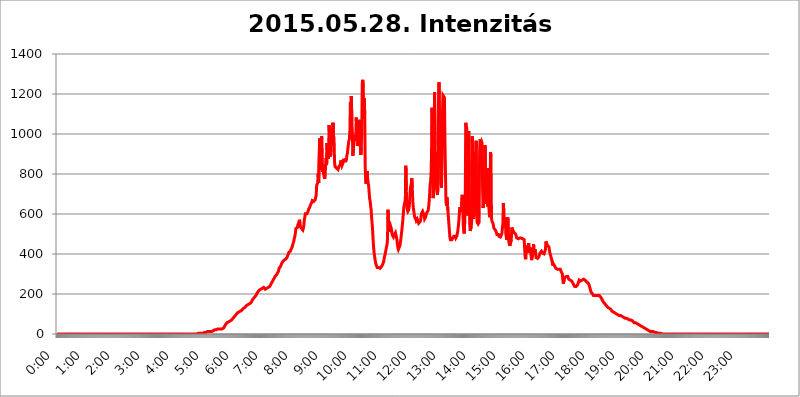
| Category | 2015.05.28. Intenzitás [W/m^2] |
|---|---|
| 0.0 | 0 |
| 0.0006944444444444445 | 0 |
| 0.001388888888888889 | 0 |
| 0.0020833333333333333 | 0 |
| 0.002777777777777778 | 0 |
| 0.003472222222222222 | 0 |
| 0.004166666666666667 | 0 |
| 0.004861111111111111 | 0 |
| 0.005555555555555556 | 0 |
| 0.0062499999999999995 | 0 |
| 0.006944444444444444 | 0 |
| 0.007638888888888889 | 0 |
| 0.008333333333333333 | 0 |
| 0.009027777777777779 | 0 |
| 0.009722222222222222 | 0 |
| 0.010416666666666666 | 0 |
| 0.011111111111111112 | 0 |
| 0.011805555555555555 | 0 |
| 0.012499999999999999 | 0 |
| 0.013194444444444444 | 0 |
| 0.013888888888888888 | 0 |
| 0.014583333333333332 | 0 |
| 0.015277777777777777 | 0 |
| 0.015972222222222224 | 0 |
| 0.016666666666666666 | 0 |
| 0.017361111111111112 | 0 |
| 0.018055555555555557 | 0 |
| 0.01875 | 0 |
| 0.019444444444444445 | 0 |
| 0.02013888888888889 | 0 |
| 0.020833333333333332 | 0 |
| 0.02152777777777778 | 0 |
| 0.022222222222222223 | 0 |
| 0.02291666666666667 | 0 |
| 0.02361111111111111 | 0 |
| 0.024305555555555556 | 0 |
| 0.024999999999999998 | 0 |
| 0.025694444444444447 | 0 |
| 0.02638888888888889 | 0 |
| 0.027083333333333334 | 0 |
| 0.027777777777777776 | 0 |
| 0.02847222222222222 | 0 |
| 0.029166666666666664 | 0 |
| 0.029861111111111113 | 0 |
| 0.030555555555555555 | 0 |
| 0.03125 | 0 |
| 0.03194444444444445 | 0 |
| 0.03263888888888889 | 0 |
| 0.03333333333333333 | 0 |
| 0.034027777777777775 | 0 |
| 0.034722222222222224 | 0 |
| 0.035416666666666666 | 0 |
| 0.036111111111111115 | 0 |
| 0.03680555555555556 | 0 |
| 0.0375 | 0 |
| 0.03819444444444444 | 0 |
| 0.03888888888888889 | 0 |
| 0.03958333333333333 | 0 |
| 0.04027777777777778 | 0 |
| 0.04097222222222222 | 0 |
| 0.041666666666666664 | 0 |
| 0.042361111111111106 | 0 |
| 0.04305555555555556 | 0 |
| 0.043750000000000004 | 0 |
| 0.044444444444444446 | 0 |
| 0.04513888888888889 | 0 |
| 0.04583333333333334 | 0 |
| 0.04652777777777778 | 0 |
| 0.04722222222222222 | 0 |
| 0.04791666666666666 | 0 |
| 0.04861111111111111 | 0 |
| 0.049305555555555554 | 0 |
| 0.049999999999999996 | 0 |
| 0.05069444444444445 | 0 |
| 0.051388888888888894 | 0 |
| 0.052083333333333336 | 0 |
| 0.05277777777777778 | 0 |
| 0.05347222222222222 | 0 |
| 0.05416666666666667 | 0 |
| 0.05486111111111111 | 0 |
| 0.05555555555555555 | 0 |
| 0.05625 | 0 |
| 0.05694444444444444 | 0 |
| 0.057638888888888885 | 0 |
| 0.05833333333333333 | 0 |
| 0.05902777777777778 | 0 |
| 0.059722222222222225 | 0 |
| 0.06041666666666667 | 0 |
| 0.061111111111111116 | 0 |
| 0.06180555555555556 | 0 |
| 0.0625 | 0 |
| 0.06319444444444444 | 0 |
| 0.06388888888888888 | 0 |
| 0.06458333333333334 | 0 |
| 0.06527777777777778 | 0 |
| 0.06597222222222222 | 0 |
| 0.06666666666666667 | 0 |
| 0.06736111111111111 | 0 |
| 0.06805555555555555 | 0 |
| 0.06874999999999999 | 0 |
| 0.06944444444444443 | 0 |
| 0.07013888888888889 | 0 |
| 0.07083333333333333 | 0 |
| 0.07152777777777779 | 0 |
| 0.07222222222222223 | 0 |
| 0.07291666666666667 | 0 |
| 0.07361111111111111 | 0 |
| 0.07430555555555556 | 0 |
| 0.075 | 0 |
| 0.07569444444444444 | 0 |
| 0.0763888888888889 | 0 |
| 0.07708333333333334 | 0 |
| 0.07777777777777778 | 0 |
| 0.07847222222222222 | 0 |
| 0.07916666666666666 | 0 |
| 0.0798611111111111 | 0 |
| 0.08055555555555556 | 0 |
| 0.08125 | 0 |
| 0.08194444444444444 | 0 |
| 0.08263888888888889 | 0 |
| 0.08333333333333333 | 0 |
| 0.08402777777777777 | 0 |
| 0.08472222222222221 | 0 |
| 0.08541666666666665 | 0 |
| 0.08611111111111112 | 0 |
| 0.08680555555555557 | 0 |
| 0.08750000000000001 | 0 |
| 0.08819444444444445 | 0 |
| 0.08888888888888889 | 0 |
| 0.08958333333333333 | 0 |
| 0.09027777777777778 | 0 |
| 0.09097222222222222 | 0 |
| 0.09166666666666667 | 0 |
| 0.09236111111111112 | 0 |
| 0.09305555555555556 | 0 |
| 0.09375 | 0 |
| 0.09444444444444444 | 0 |
| 0.09513888888888888 | 0 |
| 0.09583333333333333 | 0 |
| 0.09652777777777777 | 0 |
| 0.09722222222222222 | 0 |
| 0.09791666666666667 | 0 |
| 0.09861111111111111 | 0 |
| 0.09930555555555555 | 0 |
| 0.09999999999999999 | 0 |
| 0.10069444444444443 | 0 |
| 0.1013888888888889 | 0 |
| 0.10208333333333335 | 0 |
| 0.10277777777777779 | 0 |
| 0.10347222222222223 | 0 |
| 0.10416666666666667 | 0 |
| 0.10486111111111111 | 0 |
| 0.10555555555555556 | 0 |
| 0.10625 | 0 |
| 0.10694444444444444 | 0 |
| 0.1076388888888889 | 0 |
| 0.10833333333333334 | 0 |
| 0.10902777777777778 | 0 |
| 0.10972222222222222 | 0 |
| 0.1111111111111111 | 0 |
| 0.11180555555555556 | 0 |
| 0.11180555555555556 | 0 |
| 0.1125 | 0 |
| 0.11319444444444444 | 0 |
| 0.11388888888888889 | 0 |
| 0.11458333333333333 | 0 |
| 0.11527777777777777 | 0 |
| 0.11597222222222221 | 0 |
| 0.11666666666666665 | 0 |
| 0.1173611111111111 | 0 |
| 0.11805555555555557 | 0 |
| 0.11944444444444445 | 0 |
| 0.12013888888888889 | 0 |
| 0.12083333333333333 | 0 |
| 0.12152777777777778 | 0 |
| 0.12222222222222223 | 0 |
| 0.12291666666666667 | 0 |
| 0.12291666666666667 | 0 |
| 0.12361111111111112 | 0 |
| 0.12430555555555556 | 0 |
| 0.125 | 0 |
| 0.12569444444444444 | 0 |
| 0.12638888888888888 | 0 |
| 0.12708333333333333 | 0 |
| 0.16875 | 0 |
| 0.12847222222222224 | 0 |
| 0.12916666666666668 | 0 |
| 0.12986111111111112 | 0 |
| 0.13055555555555556 | 0 |
| 0.13125 | 0 |
| 0.13194444444444445 | 0 |
| 0.1326388888888889 | 0 |
| 0.13333333333333333 | 0 |
| 0.13402777777777777 | 0 |
| 0.13402777777777777 | 0 |
| 0.13472222222222222 | 0 |
| 0.13541666666666666 | 0 |
| 0.1361111111111111 | 0 |
| 0.13749999999999998 | 0 |
| 0.13819444444444443 | 0 |
| 0.1388888888888889 | 0 |
| 0.13958333333333334 | 0 |
| 0.14027777777777778 | 0 |
| 0.14097222222222222 | 0 |
| 0.14166666666666666 | 0 |
| 0.1423611111111111 | 0 |
| 0.14305555555555557 | 0 |
| 0.14375000000000002 | 0 |
| 0.14444444444444446 | 0 |
| 0.1451388888888889 | 0 |
| 0.1451388888888889 | 0 |
| 0.14652777777777778 | 0 |
| 0.14722222222222223 | 0 |
| 0.14791666666666667 | 0 |
| 0.1486111111111111 | 0 |
| 0.14930555555555555 | 0 |
| 0.15 | 0 |
| 0.15069444444444444 | 0 |
| 0.15138888888888888 | 0 |
| 0.15208333333333332 | 0 |
| 0.15277777777777776 | 0 |
| 0.15347222222222223 | 0 |
| 0.15416666666666667 | 0 |
| 0.15486111111111112 | 0 |
| 0.15555555555555556 | 0 |
| 0.15625 | 0 |
| 0.15694444444444444 | 0 |
| 0.15763888888888888 | 0 |
| 0.15833333333333333 | 0 |
| 0.15902777777777777 | 0 |
| 0.15972222222222224 | 0 |
| 0.16041666666666668 | 0 |
| 0.16111111111111112 | 0 |
| 0.16180555555555556 | 0 |
| 0.1625 | 0 |
| 0.16319444444444445 | 0 |
| 0.1638888888888889 | 0 |
| 0.16458333333333333 | 0 |
| 0.16527777777777777 | 0 |
| 0.16597222222222222 | 0 |
| 0.16666666666666666 | 0 |
| 0.1673611111111111 | 0 |
| 0.16805555555555554 | 0 |
| 0.16874999999999998 | 0 |
| 0.16944444444444443 | 0 |
| 0.17013888888888887 | 0 |
| 0.1708333333333333 | 0 |
| 0.17152777777777775 | 0 |
| 0.17222222222222225 | 0 |
| 0.1729166666666667 | 0 |
| 0.17361111111111113 | 0 |
| 0.17430555555555557 | 0 |
| 0.17500000000000002 | 0 |
| 0.17569444444444446 | 0 |
| 0.1763888888888889 | 0 |
| 0.17708333333333334 | 0 |
| 0.17777777777777778 | 0 |
| 0.17847222222222223 | 0 |
| 0.17916666666666667 | 0 |
| 0.1798611111111111 | 0 |
| 0.18055555555555555 | 0 |
| 0.18125 | 0 |
| 0.18194444444444444 | 0 |
| 0.1826388888888889 | 0 |
| 0.18333333333333335 | 0 |
| 0.1840277777777778 | 0 |
| 0.18472222222222223 | 0 |
| 0.18541666666666667 | 0 |
| 0.18611111111111112 | 0 |
| 0.18680555555555556 | 0 |
| 0.1875 | 0 |
| 0.18819444444444444 | 0 |
| 0.18888888888888888 | 0 |
| 0.18958333333333333 | 0 |
| 0.19027777777777777 | 0 |
| 0.1909722222222222 | 0 |
| 0.19166666666666665 | 0 |
| 0.19236111111111112 | 0 |
| 0.19305555555555554 | 0 |
| 0.19375 | 0 |
| 0.19444444444444445 | 0 |
| 0.1951388888888889 | 0 |
| 0.19583333333333333 | 0 |
| 0.19652777777777777 | 0 |
| 0.19722222222222222 | 3.525 |
| 0.19791666666666666 | 3.525 |
| 0.1986111111111111 | 3.525 |
| 0.19930555555555554 | 3.525 |
| 0.19999999999999998 | 3.525 |
| 0.20069444444444443 | 3.525 |
| 0.20138888888888887 | 3.525 |
| 0.2020833333333333 | 3.525 |
| 0.2027777777777778 | 3.525 |
| 0.2034722222222222 | 3.525 |
| 0.2041666666666667 | 3.525 |
| 0.20486111111111113 | 7.887 |
| 0.20555555555555557 | 7.887 |
| 0.20625000000000002 | 7.887 |
| 0.20694444444444446 | 7.887 |
| 0.2076388888888889 | 7.887 |
| 0.20833333333333334 | 7.887 |
| 0.20902777777777778 | 7.887 |
| 0.20972222222222223 | 7.887 |
| 0.21041666666666667 | 12.257 |
| 0.2111111111111111 | 7.887 |
| 0.21180555555555555 | 7.887 |
| 0.2125 | 12.257 |
| 0.21319444444444444 | 12.257 |
| 0.2138888888888889 | 12.257 |
| 0.21458333333333335 | 12.257 |
| 0.2152777777777778 | 12.257 |
| 0.21597222222222223 | 12.257 |
| 0.21666666666666667 | 12.257 |
| 0.21736111111111112 | 12.257 |
| 0.21805555555555556 | 12.257 |
| 0.21875 | 16.636 |
| 0.21944444444444444 | 16.636 |
| 0.22013888888888888 | 21.024 |
| 0.22083333333333333 | 21.024 |
| 0.22152777777777777 | 21.024 |
| 0.2222222222222222 | 21.024 |
| 0.22291666666666665 | 21.024 |
| 0.2236111111111111 | 21.024 |
| 0.22430555555555556 | 25.419 |
| 0.225 | 25.419 |
| 0.22569444444444445 | 25.419 |
| 0.2263888888888889 | 25.419 |
| 0.22708333333333333 | 25.419 |
| 0.22777777777777777 | 25.419 |
| 0.22847222222222222 | 25.419 |
| 0.22916666666666666 | 25.419 |
| 0.2298611111111111 | 25.419 |
| 0.23055555555555554 | 25.419 |
| 0.23124999999999998 | 25.419 |
| 0.23194444444444443 | 29.823 |
| 0.23263888888888887 | 29.823 |
| 0.2333333333333333 | 29.823 |
| 0.2340277777777778 | 34.234 |
| 0.2347222222222222 | 38.653 |
| 0.2354166666666667 | 43.079 |
| 0.23611111111111113 | 47.511 |
| 0.23680555555555557 | 47.511 |
| 0.23750000000000002 | 51.951 |
| 0.23819444444444446 | 56.398 |
| 0.2388888888888889 | 56.398 |
| 0.23958333333333334 | 56.398 |
| 0.24027777777777778 | 60.85 |
| 0.24097222222222223 | 60.85 |
| 0.24166666666666667 | 65.31 |
| 0.2423611111111111 | 65.31 |
| 0.24305555555555555 | 69.775 |
| 0.24375 | 69.775 |
| 0.24444444444444446 | 69.775 |
| 0.24513888888888888 | 74.246 |
| 0.24583333333333335 | 74.246 |
| 0.2465277777777778 | 78.722 |
| 0.24722222222222223 | 83.205 |
| 0.24791666666666667 | 83.205 |
| 0.24861111111111112 | 87.692 |
| 0.24930555555555556 | 87.692 |
| 0.25 | 92.184 |
| 0.25069444444444444 | 96.682 |
| 0.2513888888888889 | 96.682 |
| 0.2520833333333333 | 101.184 |
| 0.25277777777777777 | 105.69 |
| 0.2534722222222222 | 105.69 |
| 0.25416666666666665 | 110.201 |
| 0.2548611111111111 | 110.201 |
| 0.2555555555555556 | 110.201 |
| 0.25625000000000003 | 114.716 |
| 0.2569444444444445 | 114.716 |
| 0.2576388888888889 | 119.235 |
| 0.25833333333333336 | 119.235 |
| 0.2590277777777778 | 119.235 |
| 0.25972222222222224 | 123.758 |
| 0.2604166666666667 | 123.758 |
| 0.2611111111111111 | 128.284 |
| 0.26180555555555557 | 128.284 |
| 0.2625 | 132.814 |
| 0.26319444444444445 | 132.814 |
| 0.2638888888888889 | 137.347 |
| 0.26458333333333334 | 137.347 |
| 0.2652777777777778 | 141.884 |
| 0.2659722222222222 | 141.884 |
| 0.26666666666666666 | 141.884 |
| 0.2673611111111111 | 146.423 |
| 0.26805555555555555 | 146.423 |
| 0.26875 | 150.964 |
| 0.26944444444444443 | 150.964 |
| 0.2701388888888889 | 155.509 |
| 0.2708333333333333 | 155.509 |
| 0.27152777777777776 | 155.509 |
| 0.2722222222222222 | 160.056 |
| 0.27291666666666664 | 164.605 |
| 0.2736111111111111 | 169.156 |
| 0.2743055555555555 | 173.709 |
| 0.27499999999999997 | 173.709 |
| 0.27569444444444446 | 178.264 |
| 0.27638888888888885 | 182.82 |
| 0.27708333333333335 | 182.82 |
| 0.2777777777777778 | 187.378 |
| 0.27847222222222223 | 191.937 |
| 0.2791666666666667 | 196.497 |
| 0.2798611111111111 | 201.058 |
| 0.28055555555555556 | 205.62 |
| 0.28125 | 210.182 |
| 0.28194444444444444 | 210.182 |
| 0.2826388888888889 | 214.746 |
| 0.2833333333333333 | 219.309 |
| 0.28402777777777777 | 223.873 |
| 0.2847222222222222 | 223.873 |
| 0.28541666666666665 | 223.873 |
| 0.28611111111111115 | 223.873 |
| 0.28680555555555554 | 228.436 |
| 0.28750000000000003 | 228.436 |
| 0.2881944444444445 | 233 |
| 0.2888888888888889 | 233 |
| 0.28958333333333336 | 233 |
| 0.2902777777777778 | 228.436 |
| 0.29097222222222224 | 228.436 |
| 0.2916666666666667 | 223.873 |
| 0.2923611111111111 | 223.873 |
| 0.29305555555555557 | 223.873 |
| 0.29375 | 228.436 |
| 0.29444444444444445 | 228.436 |
| 0.2951388888888889 | 228.436 |
| 0.29583333333333334 | 233 |
| 0.2965277777777778 | 233 |
| 0.2972222222222222 | 233 |
| 0.29791666666666666 | 237.564 |
| 0.2986111111111111 | 242.127 |
| 0.29930555555555555 | 246.689 |
| 0.3 | 251.251 |
| 0.30069444444444443 | 251.251 |
| 0.3013888888888889 | 260.373 |
| 0.3020833333333333 | 264.932 |
| 0.30277777777777776 | 269.49 |
| 0.3034722222222222 | 274.047 |
| 0.30416666666666664 | 278.603 |
| 0.3048611111111111 | 283.156 |
| 0.3055555555555555 | 287.709 |
| 0.30624999999999997 | 287.709 |
| 0.3069444444444444 | 292.259 |
| 0.3076388888888889 | 296.808 |
| 0.30833333333333335 | 301.354 |
| 0.3090277777777778 | 305.898 |
| 0.30972222222222223 | 310.44 |
| 0.3104166666666667 | 314.98 |
| 0.3111111111111111 | 328.584 |
| 0.31180555555555556 | 324.052 |
| 0.3125 | 333.113 |
| 0.31319444444444444 | 337.639 |
| 0.3138888888888889 | 342.162 |
| 0.3145833333333333 | 351.198 |
| 0.31527777777777777 | 355.712 |
| 0.3159722222222222 | 360.221 |
| 0.31666666666666665 | 360.221 |
| 0.31736111111111115 | 364.728 |
| 0.31805555555555554 | 369.23 |
| 0.31875000000000003 | 369.23 |
| 0.3194444444444445 | 373.729 |
| 0.3201388888888889 | 373.729 |
| 0.32083333333333336 | 373.729 |
| 0.3215277777777778 | 378.224 |
| 0.32222222222222224 | 382.715 |
| 0.3229166666666667 | 387.202 |
| 0.3236111111111111 | 396.164 |
| 0.32430555555555557 | 400.638 |
| 0.325 | 409.574 |
| 0.32569444444444445 | 409.574 |
| 0.3263888888888889 | 414.035 |
| 0.32708333333333334 | 414.035 |
| 0.3277777777777778 | 422.943 |
| 0.3284722222222222 | 427.39 |
| 0.32916666666666666 | 431.833 |
| 0.3298611111111111 | 440.702 |
| 0.33055555555555555 | 449.551 |
| 0.33125 | 458.38 |
| 0.33194444444444443 | 467.187 |
| 0.3326388888888889 | 480.356 |
| 0.3333333333333333 | 489.108 |
| 0.3340277777777778 | 506.542 |
| 0.3347222222222222 | 528.2 |
| 0.3354166666666667 | 523.88 |
| 0.3361111111111111 | 528.2 |
| 0.3368055555555556 | 532.513 |
| 0.33749999999999997 | 545.416 |
| 0.33819444444444446 | 549.704 |
| 0.33888888888888885 | 558.261 |
| 0.33958333333333335 | 571.049 |
| 0.34027777777777773 | 562.53 |
| 0.34097222222222223 | 536.82 |
| 0.3416666666666666 | 532.513 |
| 0.3423611111111111 | 528.2 |
| 0.3430555555555555 | 523.88 |
| 0.34375 | 523.88 |
| 0.3444444444444445 | 519.555 |
| 0.3451388888888889 | 528.2 |
| 0.3458333333333334 | 541.121 |
| 0.34652777777777777 | 571.049 |
| 0.34722222222222227 | 583.779 |
| 0.34791666666666665 | 600.661 |
| 0.34861111111111115 | 600.661 |
| 0.34930555555555554 | 596.45 |
| 0.35000000000000003 | 600.661 |
| 0.3506944444444444 | 604.864 |
| 0.3513888888888889 | 609.062 |
| 0.3520833333333333 | 617.436 |
| 0.3527777777777778 | 625.784 |
| 0.3534722222222222 | 629.948 |
| 0.3541666666666667 | 634.105 |
| 0.3548611111111111 | 642.4 |
| 0.35555555555555557 | 642.4 |
| 0.35625 | 646.537 |
| 0.35694444444444445 | 658.909 |
| 0.3576388888888889 | 667.123 |
| 0.35833333333333334 | 667.123 |
| 0.3590277777777778 | 667.123 |
| 0.3597222222222222 | 663.019 |
| 0.36041666666666666 | 663.019 |
| 0.3611111111111111 | 663.019 |
| 0.36180555555555555 | 671.22 |
| 0.3625 | 683.473 |
| 0.36319444444444443 | 695.666 |
| 0.3638888888888889 | 743.859 |
| 0.3645833333333333 | 743.859 |
| 0.3652777777777778 | 755.766 |
| 0.3659722222222222 | 802.868 |
| 0.3666666666666667 | 755.766 |
| 0.3673611111111111 | 759.723 |
| 0.3680555555555556 | 977.508 |
| 0.36874999999999997 | 822.26 |
| 0.36944444444444446 | 860.676 |
| 0.37013888888888885 | 966.295 |
| 0.37083333333333335 | 988.714 |
| 0.37152777777777773 | 860.676 |
| 0.37222222222222223 | 810.641 |
| 0.3729166666666666 | 849.199 |
| 0.3736111111111111 | 798.974 |
| 0.3743055555555555 | 787.258 |
| 0.375 | 775.492 |
| 0.3756944444444445 | 798.974 |
| 0.3763888888888889 | 837.682 |
| 0.3770833333333334 | 879.719 |
| 0.37777777777777777 | 845.365 |
| 0.37847222222222227 | 955.071 |
| 0.37916666666666665 | 894.885 |
| 0.37986111111111115 | 875.918 |
| 0.38055555555555554 | 887.309 |
| 0.38125000000000003 | 1044.762 |
| 0.3819444444444444 | 999.916 |
| 0.3826388888888889 | 958.814 |
| 0.3833333333333333 | 887.309 |
| 0.3840277777777778 | 925.06 |
| 0.3847222222222222 | 951.327 |
| 0.3854166666666667 | 1022.323 |
| 0.3861111111111111 | 973.772 |
| 0.38680555555555557 | 1056.004 |
| 0.3875 | 992.448 |
| 0.38819444444444445 | 977.508 |
| 0.3888888888888889 | 860.676 |
| 0.38958333333333334 | 837.682 |
| 0.3902777777777778 | 833.834 |
| 0.3909722222222222 | 833.834 |
| 0.39166666666666666 | 829.981 |
| 0.3923611111111111 | 833.834 |
| 0.39305555555555555 | 826.123 |
| 0.39375 | 822.26 |
| 0.39444444444444443 | 826.123 |
| 0.3951388888888889 | 837.682 |
| 0.3958333333333333 | 837.682 |
| 0.3965277777777778 | 841.526 |
| 0.3972222222222222 | 849.199 |
| 0.3979166666666667 | 868.305 |
| 0.3986111111111111 | 853.029 |
| 0.3993055555555556 | 841.526 |
| 0.39999999999999997 | 837.682 |
| 0.40069444444444446 | 853.029 |
| 0.40138888888888885 | 875.918 |
| 0.40208333333333335 | 875.918 |
| 0.40277777777777773 | 864.493 |
| 0.40347222222222223 | 868.305 |
| 0.4041666666666666 | 868.305 |
| 0.4048611111111111 | 864.493 |
| 0.4055555555555555 | 872.114 |
| 0.40625 | 894.885 |
| 0.4069444444444445 | 902.447 |
| 0.4076388888888889 | 928.819 |
| 0.4083333333333334 | 947.58 |
| 0.40902777777777777 | 966.295 |
| 0.40972222222222227 | 973.772 |
| 0.41041666666666665 | 1014.852 |
| 0.41111111111111115 | 1158.689 |
| 0.41180555555555554 | 1101.226 |
| 0.41250000000000003 | 1189.969 |
| 0.4131944444444444 | 1056.004 |
| 0.4138888888888889 | 1011.118 |
| 0.4145833333333333 | 891.099 |
| 0.4152777777777778 | 925.06 |
| 0.4159722222222222 | 992.448 |
| 0.4166666666666667 | 981.244 |
| 0.4173611111111111 | 966.295 |
| 0.41805555555555557 | 981.244 |
| 0.41875 | 999.916 |
| 0.41944444444444445 | 1082.324 |
| 0.4201388888888889 | 966.295 |
| 0.42083333333333334 | 940.082 |
| 0.4215277777777778 | 943.832 |
| 0.4222222222222222 | 955.071 |
| 0.42291666666666666 | 1037.277 |
| 0.4236111111111111 | 1071.027 |
| 0.42430555555555555 | 1037.277 |
| 0.425 | 1063.51 |
| 0.42569444444444443 | 894.885 |
| 0.4263888888888889 | 932.576 |
| 0.4270833333333333 | 1003.65 |
| 0.4277777777777778 | 1254.387 |
| 0.4284722222222222 | 1270.964 |
| 0.4291666666666667 | 1233.951 |
| 0.4298611111111111 | 1074.789 |
| 0.4305555555555556 | 1178.177 |
| 0.43124999999999997 | 1101.226 |
| 0.43194444444444446 | 829.981 |
| 0.43263888888888885 | 759.723 |
| 0.43333333333333335 | 751.803 |
| 0.43402777777777773 | 751.803 |
| 0.43472222222222223 | 814.519 |
| 0.4354166666666666 | 771.559 |
| 0.4361111111111111 | 767.62 |
| 0.4368055555555555 | 739.877 |
| 0.4375 | 703.762 |
| 0.4381944444444445 | 675.311 |
| 0.4388888888888889 | 663.019 |
| 0.4395833333333334 | 663.019 |
| 0.44027777777777777 | 617.436 |
| 0.44097222222222227 | 579.542 |
| 0.44166666666666665 | 549.704 |
| 0.44236111111111115 | 515.223 |
| 0.44305555555555554 | 467.187 |
| 0.44375000000000003 | 431.833 |
| 0.4444444444444444 | 405.108 |
| 0.4451388888888889 | 387.202 |
| 0.4458333333333333 | 369.23 |
| 0.4465277777777778 | 355.712 |
| 0.4472222222222222 | 346.682 |
| 0.4479166666666667 | 342.162 |
| 0.4486111111111111 | 333.113 |
| 0.44930555555555557 | 333.113 |
| 0.45 | 333.113 |
| 0.45069444444444445 | 333.113 |
| 0.4513888888888889 | 333.113 |
| 0.45208333333333334 | 333.113 |
| 0.4527777777777778 | 328.584 |
| 0.4534722222222222 | 333.113 |
| 0.45416666666666666 | 333.113 |
| 0.4548611111111111 | 337.639 |
| 0.45555555555555555 | 342.162 |
| 0.45625 | 346.682 |
| 0.45694444444444443 | 351.198 |
| 0.4576388888888889 | 360.221 |
| 0.4583333333333333 | 373.729 |
| 0.4590277777777778 | 387.202 |
| 0.4597222222222222 | 396.164 |
| 0.4604166666666667 | 409.574 |
| 0.4611111111111111 | 422.943 |
| 0.4618055555555556 | 436.27 |
| 0.46249999999999997 | 445.129 |
| 0.46319444444444446 | 475.972 |
| 0.46388888888888885 | 621.613 |
| 0.46458333333333335 | 558.261 |
| 0.46527777777777773 | 528.2 |
| 0.46597222222222223 | 510.885 |
| 0.4666666666666666 | 532.513 |
| 0.4673611111111111 | 541.121 |
| 0.4680555555555555 | 541.121 |
| 0.46875 | 523.88 |
| 0.4694444444444445 | 502.192 |
| 0.4701388888888889 | 493.475 |
| 0.4708333333333334 | 489.108 |
| 0.47152777777777777 | 484.735 |
| 0.47222222222222227 | 489.108 |
| 0.47291666666666665 | 497.836 |
| 0.47361111111111115 | 497.836 |
| 0.47430555555555554 | 506.542 |
| 0.47500000000000003 | 502.192 |
| 0.4756944444444444 | 484.735 |
| 0.4763888888888889 | 471.582 |
| 0.4770833333333333 | 449.551 |
| 0.4777777777777778 | 431.833 |
| 0.4784722222222222 | 422.943 |
| 0.4791666666666667 | 422.943 |
| 0.4798611111111111 | 427.39 |
| 0.48055555555555557 | 440.702 |
| 0.48125 | 458.38 |
| 0.48194444444444445 | 475.972 |
| 0.4826388888888889 | 497.836 |
| 0.48333333333333334 | 519.555 |
| 0.4840277777777778 | 545.416 |
| 0.4847222222222222 | 571.049 |
| 0.48541666666666666 | 604.864 |
| 0.4861111111111111 | 634.105 |
| 0.48680555555555555 | 638.256 |
| 0.4875 | 634.105 |
| 0.48819444444444443 | 671.22 |
| 0.4888888888888889 | 841.526 |
| 0.4895833333333333 | 719.877 |
| 0.4902777777777778 | 638.256 |
| 0.4909722222222222 | 621.613 |
| 0.4916666666666667 | 613.252 |
| 0.4923611111111111 | 613.252 |
| 0.4930555555555556 | 621.613 |
| 0.49374999999999997 | 642.4 |
| 0.49444444444444446 | 679.395 |
| 0.49513888888888885 | 719.877 |
| 0.49583333333333335 | 739.877 |
| 0.49652777777777773 | 751.803 |
| 0.49722222222222223 | 779.42 |
| 0.4979166666666666 | 731.896 |
| 0.4986111111111111 | 667.123 |
| 0.4993055555555555 | 634.105 |
| 0.5 | 617.436 |
| 0.5006944444444444 | 596.45 |
| 0.5013888888888889 | 583.779 |
| 0.5020833333333333 | 579.542 |
| 0.5027777777777778 | 575.299 |
| 0.5034722222222222 | 566.793 |
| 0.5041666666666667 | 571.049 |
| 0.5048611111111111 | 575.299 |
| 0.5055555555555555 | 571.049 |
| 0.50625 | 562.53 |
| 0.5069444444444444 | 553.986 |
| 0.5076388888888889 | 553.986 |
| 0.5083333333333333 | 558.261 |
| 0.5090277777777777 | 562.53 |
| 0.5097222222222222 | 571.049 |
| 0.5104166666666666 | 592.233 |
| 0.5111111111111112 | 604.864 |
| 0.5118055555555555 | 609.062 |
| 0.5125000000000001 | 613.252 |
| 0.5131944444444444 | 617.436 |
| 0.513888888888889 | 617.436 |
| 0.5145833333333333 | 592.233 |
| 0.5152777777777778 | 575.299 |
| 0.5159722222222222 | 571.049 |
| 0.5166666666666667 | 583.779 |
| 0.517361111111111 | 596.45 |
| 0.5180555555555556 | 604.864 |
| 0.5187499999999999 | 609.062 |
| 0.5194444444444445 | 609.062 |
| 0.5201388888888888 | 617.436 |
| 0.5208333333333334 | 634.105 |
| 0.5215277777777778 | 658.909 |
| 0.5222222222222223 | 695.666 |
| 0.5229166666666667 | 743.859 |
| 0.5236111111111111 | 763.674 |
| 0.5243055555555556 | 798.974 |
| 0.525 | 906.223 |
| 0.5256944444444445 | 1131.708 |
| 0.5263888888888889 | 779.42 |
| 0.5270833333333333 | 679.395 |
| 0.5277777777777778 | 679.395 |
| 0.5284722222222222 | 735.89 |
| 0.5291666666666667 | 1209.807 |
| 0.5298611111111111 | 940.082 |
| 0.5305555555555556 | 795.074 |
| 0.53125 | 909.996 |
| 0.5319444444444444 | 739.877 |
| 0.5326388888888889 | 707.8 |
| 0.5333333333333333 | 695.666 |
| 0.5340277777777778 | 759.723 |
| 0.5347222222222222 | 1154.814 |
| 0.5354166666666667 | 1258.511 |
| 0.5361111111111111 | 1048.508 |
| 0.5368055555555555 | 906.223 |
| 0.5375 | 928.819 |
| 0.5381944444444444 | 759.723 |
| 0.5388888888888889 | 731.896 |
| 0.5395833333333333 | 731.896 |
| 0.5402777777777777 | 1101.226 |
| 0.5409722222222222 | 1193.918 |
| 0.5416666666666666 | 1193.918 |
| 0.5423611111111112 | 1189.969 |
| 0.5430555555555555 | 1182.099 |
| 0.5437500000000001 | 966.295 |
| 0.5444444444444444 | 814.519 |
| 0.545138888888889 | 667.123 |
| 0.5458333333333333 | 642.4 |
| 0.5465277777777778 | 683.473 |
| 0.5472222222222222 | 679.395 |
| 0.5479166666666667 | 617.436 |
| 0.548611111111111 | 583.779 |
| 0.5493055555555556 | 549.704 |
| 0.5499999999999999 | 515.223 |
| 0.5506944444444445 | 484.735 |
| 0.5513888888888888 | 471.582 |
| 0.5520833333333334 | 467.187 |
| 0.5527777777777778 | 467.187 |
| 0.5534722222222223 | 471.582 |
| 0.5541666666666667 | 475.972 |
| 0.5548611111111111 | 480.356 |
| 0.5555555555555556 | 484.735 |
| 0.55625 | 489.108 |
| 0.5569444444444445 | 489.108 |
| 0.5576388888888889 | 489.108 |
| 0.5583333333333333 | 489.108 |
| 0.5590277777777778 | 480.356 |
| 0.5597222222222222 | 480.356 |
| 0.5604166666666667 | 489.108 |
| 0.5611111111111111 | 502.192 |
| 0.5618055555555556 | 515.223 |
| 0.5625 | 536.82 |
| 0.5631944444444444 | 562.53 |
| 0.5638888888888889 | 600.661 |
| 0.5645833333333333 | 634.105 |
| 0.5652777777777778 | 634.105 |
| 0.5659722222222222 | 617.436 |
| 0.5666666666666667 | 609.062 |
| 0.5673611111111111 | 604.864 |
| 0.5680555555555555 | 695.666 |
| 0.56875 | 663.019 |
| 0.5694444444444444 | 541.121 |
| 0.5701388888888889 | 515.223 |
| 0.5708333333333333 | 502.192 |
| 0.5715277777777777 | 566.793 |
| 0.5722222222222222 | 658.909 |
| 0.5729166666666666 | 1056.004 |
| 0.5736111111111112 | 1037.277 |
| 0.5743055555555555 | 1029.798 |
| 0.5750000000000001 | 592.233 |
| 0.5756944444444444 | 818.392 |
| 0.576388888888889 | 833.834 |
| 0.5770833333333333 | 1014.852 |
| 0.5777777777777778 | 787.258 |
| 0.5784722222222222 | 549.704 |
| 0.5791666666666667 | 515.223 |
| 0.579861111111111 | 519.555 |
| 0.5805555555555556 | 536.82 |
| 0.5812499999999999 | 562.53 |
| 0.5819444444444445 | 988.714 |
| 0.5826388888888888 | 906.223 |
| 0.5833333333333334 | 575.299 |
| 0.5840277777777778 | 667.123 |
| 0.5847222222222223 | 902.447 |
| 0.5854166666666667 | 909.996 |
| 0.5861111111111111 | 751.803 |
| 0.5868055555555556 | 868.305 |
| 0.5875 | 966.295 |
| 0.5881944444444445 | 592.233 |
| 0.5888888888888889 | 558.261 |
| 0.5895833333333333 | 553.986 |
| 0.5902777777777778 | 549.704 |
| 0.5909722222222222 | 553.986 |
| 0.5916666666666667 | 558.261 |
| 0.5923611111111111 | 909.996 |
| 0.5930555555555556 | 973.772 |
| 0.59375 | 966.295 |
| 0.5944444444444444 | 955.071 |
| 0.5951388888888889 | 962.555 |
| 0.5958333333333333 | 955.071 |
| 0.5965277777777778 | 727.896 |
| 0.5972222222222222 | 629.948 |
| 0.5979166666666667 | 625.784 |
| 0.5986111111111111 | 683.473 |
| 0.5993055555555555 | 837.682 |
| 0.6 | 943.832 |
| 0.6006944444444444 | 943.832 |
| 0.6013888888888889 | 650.667 |
| 0.6020833333333333 | 658.909 |
| 0.6027777777777777 | 699.717 |
| 0.6034722222222222 | 638.256 |
| 0.6041666666666666 | 829.981 |
| 0.6048611111111112 | 646.537 |
| 0.6055555555555555 | 625.784 |
| 0.6062500000000001 | 583.779 |
| 0.6069444444444444 | 600.661 |
| 0.607638888888889 | 909.996 |
| 0.6083333333333333 | 887.309 |
| 0.6090277777777778 | 579.542 |
| 0.6097222222222222 | 562.53 |
| 0.6104166666666667 | 562.53 |
| 0.611111111111111 | 553.986 |
| 0.6118055555555556 | 541.121 |
| 0.6124999999999999 | 528.2 |
| 0.6131944444444445 | 528.2 |
| 0.6138888888888888 | 523.88 |
| 0.6145833333333334 | 519.555 |
| 0.6152777777777778 | 515.223 |
| 0.6159722222222223 | 506.542 |
| 0.6166666666666667 | 497.836 |
| 0.6173611111111111 | 497.836 |
| 0.6180555555555556 | 502.192 |
| 0.61875 | 497.836 |
| 0.6194444444444445 | 489.108 |
| 0.6201388888888889 | 484.735 |
| 0.6208333333333333 | 484.735 |
| 0.6215277777777778 | 484.735 |
| 0.6222222222222222 | 484.735 |
| 0.6229166666666667 | 489.108 |
| 0.6236111111111111 | 502.192 |
| 0.6243055555555556 | 528.2 |
| 0.625 | 553.986 |
| 0.6256944444444444 | 654.791 |
| 0.6263888888888889 | 604.864 |
| 0.6270833333333333 | 562.53 |
| 0.6277777777777778 | 583.779 |
| 0.6284722222222222 | 562.53 |
| 0.6291666666666667 | 502.192 |
| 0.6298611111111111 | 484.735 |
| 0.6305555555555555 | 471.582 |
| 0.63125 | 553.986 |
| 0.6319444444444444 | 583.779 |
| 0.6326388888888889 | 506.542 |
| 0.6333333333333333 | 462.786 |
| 0.6340277777777777 | 449.551 |
| 0.6347222222222222 | 440.702 |
| 0.6354166666666666 | 440.702 |
| 0.6361111111111112 | 436.27 |
| 0.6368055555555555 | 471.582 |
| 0.6375000000000001 | 532.513 |
| 0.6381944444444444 | 523.88 |
| 0.638888888888889 | 519.555 |
| 0.6395833333333333 | 515.223 |
| 0.6402777777777778 | 510.885 |
| 0.6409722222222222 | 506.542 |
| 0.6416666666666667 | 502.192 |
| 0.642361111111111 | 502.192 |
| 0.6430555555555556 | 497.836 |
| 0.6437499999999999 | 489.108 |
| 0.6444444444444445 | 480.356 |
| 0.6451388888888888 | 475.972 |
| 0.6458333333333334 | 475.972 |
| 0.6465277777777778 | 475.972 |
| 0.6472222222222223 | 475.972 |
| 0.6479166666666667 | 480.356 |
| 0.6486111111111111 | 480.356 |
| 0.6493055555555556 | 480.356 |
| 0.65 | 480.356 |
| 0.6506944444444445 | 480.356 |
| 0.6513888888888889 | 475.972 |
| 0.6520833333333333 | 475.972 |
| 0.6527777777777778 | 475.972 |
| 0.6534722222222222 | 471.582 |
| 0.6541666666666667 | 471.582 |
| 0.6548611111111111 | 471.582 |
| 0.6555555555555556 | 467.187 |
| 0.65625 | 387.202 |
| 0.6569444444444444 | 373.729 |
| 0.6576388888888889 | 431.833 |
| 0.6583333333333333 | 405.108 |
| 0.6590277777777778 | 440.702 |
| 0.6597222222222222 | 422.943 |
| 0.6604166666666667 | 440.702 |
| 0.6611111111111111 | 453.968 |
| 0.6618055555555555 | 422.943 |
| 0.6625 | 405.108 |
| 0.6631944444444444 | 431.833 |
| 0.6638888888888889 | 414.035 |
| 0.6645833333333333 | 414.035 |
| 0.6652777777777777 | 369.23 |
| 0.6659722222222222 | 369.23 |
| 0.6666666666666666 | 373.729 |
| 0.6673611111111111 | 414.035 |
| 0.6680555555555556 | 449.551 |
| 0.6687500000000001 | 409.574 |
| 0.6694444444444444 | 396.164 |
| 0.6701388888888888 | 422.943 |
| 0.6708333333333334 | 409.574 |
| 0.6715277777777778 | 382.715 |
| 0.6722222222222222 | 378.224 |
| 0.6729166666666666 | 378.224 |
| 0.6736111111111112 | 378.224 |
| 0.6743055555555556 | 373.729 |
| 0.6749999999999999 | 378.224 |
| 0.6756944444444444 | 387.202 |
| 0.6763888888888889 | 396.164 |
| 0.6770833333333334 | 405.108 |
| 0.6777777777777777 | 405.108 |
| 0.6784722222222223 | 409.574 |
| 0.6791666666666667 | 414.035 |
| 0.6798611111111111 | 409.574 |
| 0.6805555555555555 | 405.108 |
| 0.68125 | 405.108 |
| 0.6819444444444445 | 405.108 |
| 0.6826388888888889 | 400.638 |
| 0.6833333333333332 | 396.164 |
| 0.6840277777777778 | 414.035 |
| 0.6847222222222222 | 422.943 |
| 0.6854166666666667 | 462.786 |
| 0.686111111111111 | 467.187 |
| 0.6868055555555556 | 462.786 |
| 0.6875 | 440.702 |
| 0.6881944444444444 | 436.27 |
| 0.688888888888889 | 440.702 |
| 0.6895833333333333 | 436.27 |
| 0.6902777777777778 | 418.492 |
| 0.6909722222222222 | 405.108 |
| 0.6916666666666668 | 400.638 |
| 0.6923611111111111 | 387.202 |
| 0.6930555555555555 | 378.224 |
| 0.69375 | 382.715 |
| 0.6944444444444445 | 373.729 |
| 0.6951388888888889 | 342.162 |
| 0.6958333333333333 | 351.198 |
| 0.6965277777777777 | 351.198 |
| 0.6972222222222223 | 346.682 |
| 0.6979166666666666 | 337.639 |
| 0.6986111111111111 | 333.113 |
| 0.6993055555555556 | 328.584 |
| 0.7000000000000001 | 324.052 |
| 0.7006944444444444 | 324.052 |
| 0.7013888888888888 | 324.052 |
| 0.7020833333333334 | 324.052 |
| 0.7027777777777778 | 324.052 |
| 0.7034722222222222 | 324.052 |
| 0.7041666666666666 | 328.584 |
| 0.7048611111111112 | 328.584 |
| 0.7055555555555556 | 324.052 |
| 0.7062499999999999 | 319.517 |
| 0.7069444444444444 | 310.44 |
| 0.7076388888888889 | 305.898 |
| 0.7083333333333334 | 301.354 |
| 0.7090277777777777 | 296.808 |
| 0.7097222222222223 | 251.251 |
| 0.7104166666666667 | 251.251 |
| 0.7111111111111111 | 274.047 |
| 0.7118055555555555 | 283.156 |
| 0.7125 | 283.156 |
| 0.7131944444444445 | 287.709 |
| 0.7138888888888889 | 287.709 |
| 0.7145833333333332 | 287.709 |
| 0.7152777777777778 | 287.709 |
| 0.7159722222222222 | 287.709 |
| 0.7166666666666667 | 283.156 |
| 0.717361111111111 | 274.047 |
| 0.7180555555555556 | 269.49 |
| 0.71875 | 269.49 |
| 0.7194444444444444 | 269.49 |
| 0.720138888888889 | 269.49 |
| 0.7208333333333333 | 269.49 |
| 0.7215277777777778 | 264.932 |
| 0.7222222222222222 | 260.373 |
| 0.7229166666666668 | 255.813 |
| 0.7236111111111111 | 251.251 |
| 0.7243055555555555 | 246.689 |
| 0.725 | 242.127 |
| 0.7256944444444445 | 237.564 |
| 0.7263888888888889 | 237.564 |
| 0.7270833333333333 | 237.564 |
| 0.7277777777777777 | 237.564 |
| 0.7284722222222223 | 237.564 |
| 0.7291666666666666 | 242.127 |
| 0.7298611111111111 | 246.689 |
| 0.7305555555555556 | 251.251 |
| 0.7312500000000001 | 260.373 |
| 0.7319444444444444 | 269.49 |
| 0.7326388888888888 | 269.49 |
| 0.7333333333333334 | 264.932 |
| 0.7340277777777778 | 264.932 |
| 0.7347222222222222 | 264.932 |
| 0.7354166666666666 | 269.49 |
| 0.7361111111111112 | 269.49 |
| 0.7368055555555556 | 274.047 |
| 0.7374999999999999 | 274.047 |
| 0.7381944444444444 | 274.047 |
| 0.7388888888888889 | 274.047 |
| 0.7395833333333334 | 274.047 |
| 0.7402777777777777 | 269.49 |
| 0.7409722222222223 | 264.932 |
| 0.7416666666666667 | 264.932 |
| 0.7423611111111111 | 260.373 |
| 0.7430555555555555 | 260.373 |
| 0.74375 | 255.813 |
| 0.7444444444444445 | 255.813 |
| 0.7451388888888889 | 251.251 |
| 0.7458333333333332 | 246.689 |
| 0.7465277777777778 | 242.127 |
| 0.7472222222222222 | 228.436 |
| 0.7479166666666667 | 219.309 |
| 0.748611111111111 | 210.182 |
| 0.7493055555555556 | 205.62 |
| 0.75 | 205.62 |
| 0.7506944444444444 | 201.058 |
| 0.751388888888889 | 196.497 |
| 0.7520833333333333 | 191.937 |
| 0.7527777777777778 | 191.937 |
| 0.7534722222222222 | 191.937 |
| 0.7541666666666668 | 191.937 |
| 0.7548611111111111 | 191.937 |
| 0.7555555555555555 | 191.937 |
| 0.75625 | 191.937 |
| 0.7569444444444445 | 191.937 |
| 0.7576388888888889 | 191.937 |
| 0.7583333333333333 | 191.937 |
| 0.7590277777777777 | 191.937 |
| 0.7597222222222223 | 191.937 |
| 0.7604166666666666 | 191.937 |
| 0.7611111111111111 | 187.378 |
| 0.7618055555555556 | 187.378 |
| 0.7625000000000001 | 182.82 |
| 0.7631944444444444 | 182.82 |
| 0.7638888888888888 | 178.264 |
| 0.7645833333333334 | 169.156 |
| 0.7652777777777778 | 164.605 |
| 0.7659722222222222 | 160.056 |
| 0.7666666666666666 | 155.509 |
| 0.7673611111111112 | 155.509 |
| 0.7680555555555556 | 150.964 |
| 0.7687499999999999 | 146.423 |
| 0.7694444444444444 | 146.423 |
| 0.7701388888888889 | 141.884 |
| 0.7708333333333334 | 137.347 |
| 0.7715277777777777 | 137.347 |
| 0.7722222222222223 | 132.814 |
| 0.7729166666666667 | 132.814 |
| 0.7736111111111111 | 128.284 |
| 0.7743055555555555 | 128.284 |
| 0.775 | 123.758 |
| 0.7756944444444445 | 123.758 |
| 0.7763888888888889 | 123.758 |
| 0.7770833333333332 | 119.235 |
| 0.7777777777777778 | 114.716 |
| 0.7784722222222222 | 114.716 |
| 0.7791666666666667 | 110.201 |
| 0.779861111111111 | 110.201 |
| 0.7805555555555556 | 110.201 |
| 0.78125 | 110.201 |
| 0.7819444444444444 | 105.69 |
| 0.782638888888889 | 105.69 |
| 0.7833333333333333 | 101.184 |
| 0.7840277777777778 | 101.184 |
| 0.7847222222222222 | 101.184 |
| 0.7854166666666668 | 101.184 |
| 0.7861111111111111 | 96.682 |
| 0.7868055555555555 | 96.682 |
| 0.7875 | 96.682 |
| 0.7881944444444445 | 92.184 |
| 0.7888888888888889 | 92.184 |
| 0.7895833333333333 | 92.184 |
| 0.7902777777777777 | 92.184 |
| 0.7909722222222223 | 87.692 |
| 0.7916666666666666 | 87.692 |
| 0.7923611111111111 | 87.692 |
| 0.7930555555555556 | 83.205 |
| 0.7937500000000001 | 83.205 |
| 0.7944444444444444 | 83.205 |
| 0.7951388888888888 | 83.205 |
| 0.7958333333333334 | 83.205 |
| 0.7965277777777778 | 78.722 |
| 0.7972222222222222 | 78.722 |
| 0.7979166666666666 | 78.722 |
| 0.7986111111111112 | 78.722 |
| 0.7993055555555556 | 74.246 |
| 0.7999999999999999 | 74.246 |
| 0.8006944444444444 | 74.246 |
| 0.8013888888888889 | 74.246 |
| 0.8020833333333334 | 74.246 |
| 0.8027777777777777 | 69.775 |
| 0.8034722222222223 | 69.775 |
| 0.8041666666666667 | 69.775 |
| 0.8048611111111111 | 69.775 |
| 0.8055555555555555 | 65.31 |
| 0.80625 | 65.31 |
| 0.8069444444444445 | 65.31 |
| 0.8076388888888889 | 60.85 |
| 0.8083333333333332 | 60.85 |
| 0.8090277777777778 | 56.398 |
| 0.8097222222222222 | 56.398 |
| 0.8104166666666667 | 56.398 |
| 0.811111111111111 | 56.398 |
| 0.8118055555555556 | 56.398 |
| 0.8125 | 51.951 |
| 0.8131944444444444 | 51.951 |
| 0.813888888888889 | 51.951 |
| 0.8145833333333333 | 51.951 |
| 0.8152777777777778 | 47.511 |
| 0.8159722222222222 | 47.511 |
| 0.8166666666666668 | 43.079 |
| 0.8173611111111111 | 43.079 |
| 0.8180555555555555 | 43.079 |
| 0.81875 | 38.653 |
| 0.8194444444444445 | 38.653 |
| 0.8201388888888889 | 38.653 |
| 0.8208333333333333 | 34.234 |
| 0.8215277777777777 | 34.234 |
| 0.8222222222222223 | 29.823 |
| 0.8229166666666666 | 29.823 |
| 0.8236111111111111 | 29.823 |
| 0.8243055555555556 | 25.419 |
| 0.8250000000000001 | 25.419 |
| 0.8256944444444444 | 25.419 |
| 0.8263888888888888 | 21.024 |
| 0.8270833333333334 | 21.024 |
| 0.8277777777777778 | 21.024 |
| 0.8284722222222222 | 21.024 |
| 0.8291666666666666 | 21.024 |
| 0.8298611111111112 | 16.636 |
| 0.8305555555555556 | 16.636 |
| 0.8312499999999999 | 16.636 |
| 0.8319444444444444 | 12.257 |
| 0.8326388888888889 | 12.257 |
| 0.8333333333333334 | 12.257 |
| 0.8340277777777777 | 12.257 |
| 0.8347222222222223 | 12.257 |
| 0.8354166666666667 | 12.257 |
| 0.8361111111111111 | 12.257 |
| 0.8368055555555555 | 12.257 |
| 0.8375 | 12.257 |
| 0.8381944444444445 | 7.887 |
| 0.8388888888888889 | 7.887 |
| 0.8395833333333332 | 7.887 |
| 0.8402777777777778 | 7.887 |
| 0.8409722222222222 | 7.887 |
| 0.8416666666666667 | 7.887 |
| 0.842361111111111 | 3.525 |
| 0.8430555555555556 | 3.525 |
| 0.84375 | 3.525 |
| 0.8444444444444444 | 3.525 |
| 0.845138888888889 | 3.525 |
| 0.8458333333333333 | 3.525 |
| 0.8465277777777778 | 3.525 |
| 0.8472222222222222 | 0 |
| 0.8479166666666668 | 0 |
| 0.8486111111111111 | 0 |
| 0.8493055555555555 | 0 |
| 0.85 | 0 |
| 0.8506944444444445 | 0 |
| 0.8513888888888889 | 0 |
| 0.8520833333333333 | 0 |
| 0.8527777777777777 | 0 |
| 0.8534722222222223 | 0 |
| 0.8541666666666666 | 0 |
| 0.8548611111111111 | 0 |
| 0.8555555555555556 | 0 |
| 0.8562500000000001 | 0 |
| 0.8569444444444444 | 0 |
| 0.8576388888888888 | 0 |
| 0.8583333333333334 | 0 |
| 0.8590277777777778 | 0 |
| 0.8597222222222222 | 0 |
| 0.8604166666666666 | 0 |
| 0.8611111111111112 | 0 |
| 0.8618055555555556 | 0 |
| 0.8624999999999999 | 0 |
| 0.8631944444444444 | 0 |
| 0.8638888888888889 | 0 |
| 0.8645833333333334 | 0 |
| 0.8652777777777777 | 0 |
| 0.8659722222222223 | 0 |
| 0.8666666666666667 | 0 |
| 0.8673611111111111 | 0 |
| 0.8680555555555555 | 0 |
| 0.86875 | 0 |
| 0.8694444444444445 | 0 |
| 0.8701388888888889 | 0 |
| 0.8708333333333332 | 0 |
| 0.8715277777777778 | 0 |
| 0.8722222222222222 | 0 |
| 0.8729166666666667 | 0 |
| 0.873611111111111 | 0 |
| 0.8743055555555556 | 0 |
| 0.875 | 0 |
| 0.8756944444444444 | 0 |
| 0.876388888888889 | 0 |
| 0.8770833333333333 | 0 |
| 0.8777777777777778 | 0 |
| 0.8784722222222222 | 0 |
| 0.8791666666666668 | 0 |
| 0.8798611111111111 | 0 |
| 0.8805555555555555 | 0 |
| 0.88125 | 0 |
| 0.8819444444444445 | 0 |
| 0.8826388888888889 | 0 |
| 0.8833333333333333 | 0 |
| 0.8840277777777777 | 0 |
| 0.8847222222222223 | 0 |
| 0.8854166666666666 | 0 |
| 0.8861111111111111 | 0 |
| 0.8868055555555556 | 0 |
| 0.8875000000000001 | 0 |
| 0.8881944444444444 | 0 |
| 0.8888888888888888 | 0 |
| 0.8895833333333334 | 0 |
| 0.8902777777777778 | 0 |
| 0.8909722222222222 | 0 |
| 0.8916666666666666 | 0 |
| 0.8923611111111112 | 0 |
| 0.8930555555555556 | 0 |
| 0.8937499999999999 | 0 |
| 0.8944444444444444 | 0 |
| 0.8951388888888889 | 0 |
| 0.8958333333333334 | 0 |
| 0.8965277777777777 | 0 |
| 0.8972222222222223 | 0 |
| 0.8979166666666667 | 0 |
| 0.8986111111111111 | 0 |
| 0.8993055555555555 | 0 |
| 0.9 | 0 |
| 0.9006944444444445 | 0 |
| 0.9013888888888889 | 0 |
| 0.9020833333333332 | 0 |
| 0.9027777777777778 | 0 |
| 0.9034722222222222 | 0 |
| 0.9041666666666667 | 0 |
| 0.904861111111111 | 0 |
| 0.9055555555555556 | 0 |
| 0.90625 | 0 |
| 0.9069444444444444 | 0 |
| 0.907638888888889 | 0 |
| 0.9083333333333333 | 0 |
| 0.9090277777777778 | 0 |
| 0.9097222222222222 | 0 |
| 0.9104166666666668 | 0 |
| 0.9111111111111111 | 0 |
| 0.9118055555555555 | 0 |
| 0.9125 | 0 |
| 0.9131944444444445 | 0 |
| 0.9138888888888889 | 0 |
| 0.9145833333333333 | 0 |
| 0.9152777777777777 | 0 |
| 0.9159722222222223 | 0 |
| 0.9166666666666666 | 0 |
| 0.9173611111111111 | 0 |
| 0.9180555555555556 | 0 |
| 0.9187500000000001 | 0 |
| 0.9194444444444444 | 0 |
| 0.9201388888888888 | 0 |
| 0.9208333333333334 | 0 |
| 0.9215277777777778 | 0 |
| 0.9222222222222222 | 0 |
| 0.9229166666666666 | 0 |
| 0.9236111111111112 | 0 |
| 0.9243055555555556 | 0 |
| 0.9249999999999999 | 0 |
| 0.9256944444444444 | 0 |
| 0.9263888888888889 | 0 |
| 0.9270833333333334 | 0 |
| 0.9277777777777777 | 0 |
| 0.9284722222222223 | 0 |
| 0.9291666666666667 | 0 |
| 0.9298611111111111 | 0 |
| 0.9305555555555555 | 0 |
| 0.93125 | 0 |
| 0.9319444444444445 | 0 |
| 0.9326388888888889 | 0 |
| 0.9333333333333332 | 0 |
| 0.9340277777777778 | 0 |
| 0.9347222222222222 | 0 |
| 0.9354166666666667 | 0 |
| 0.936111111111111 | 0 |
| 0.9368055555555556 | 0 |
| 0.9375 | 0 |
| 0.9381944444444444 | 0 |
| 0.938888888888889 | 0 |
| 0.9395833333333333 | 0 |
| 0.9402777777777778 | 0 |
| 0.9409722222222222 | 0 |
| 0.9416666666666668 | 0 |
| 0.9423611111111111 | 0 |
| 0.9430555555555555 | 0 |
| 0.94375 | 0 |
| 0.9444444444444445 | 0 |
| 0.9451388888888889 | 0 |
| 0.9458333333333333 | 0 |
| 0.9465277777777777 | 0 |
| 0.9472222222222223 | 0 |
| 0.9479166666666666 | 0 |
| 0.9486111111111111 | 0 |
| 0.9493055555555556 | 0 |
| 0.9500000000000001 | 0 |
| 0.9506944444444444 | 0 |
| 0.9513888888888888 | 0 |
| 0.9520833333333334 | 0 |
| 0.9527777777777778 | 0 |
| 0.9534722222222222 | 0 |
| 0.9541666666666666 | 0 |
| 0.9548611111111112 | 0 |
| 0.9555555555555556 | 0 |
| 0.9562499999999999 | 0 |
| 0.9569444444444444 | 0 |
| 0.9576388888888889 | 0 |
| 0.9583333333333334 | 0 |
| 0.9590277777777777 | 0 |
| 0.9597222222222223 | 0 |
| 0.9604166666666667 | 0 |
| 0.9611111111111111 | 0 |
| 0.9618055555555555 | 0 |
| 0.9625 | 0 |
| 0.9631944444444445 | 0 |
| 0.9638888888888889 | 0 |
| 0.9645833333333332 | 0 |
| 0.9652777777777778 | 0 |
| 0.9659722222222222 | 0 |
| 0.9666666666666667 | 0 |
| 0.967361111111111 | 0 |
| 0.9680555555555556 | 0 |
| 0.96875 | 0 |
| 0.9694444444444444 | 0 |
| 0.970138888888889 | 0 |
| 0.9708333333333333 | 0 |
| 0.9715277777777778 | 0 |
| 0.9722222222222222 | 0 |
| 0.9729166666666668 | 0 |
| 0.9736111111111111 | 0 |
| 0.9743055555555555 | 0 |
| 0.975 | 0 |
| 0.9756944444444445 | 0 |
| 0.9763888888888889 | 0 |
| 0.9770833333333333 | 0 |
| 0.9777777777777777 | 0 |
| 0.9784722222222223 | 0 |
| 0.9791666666666666 | 0 |
| 0.9798611111111111 | 0 |
| 0.9805555555555556 | 0 |
| 0.9812500000000001 | 0 |
| 0.9819444444444444 | 0 |
| 0.9826388888888888 | 0 |
| 0.9833333333333334 | 0 |
| 0.9840277777777778 | 0 |
| 0.9847222222222222 | 0 |
| 0.9854166666666666 | 0 |
| 0.9861111111111112 | 0 |
| 0.9868055555555556 | 0 |
| 0.9874999999999999 | 0 |
| 0.9881944444444444 | 0 |
| 0.9888888888888889 | 0 |
| 0.9895833333333334 | 0 |
| 0.9902777777777777 | 0 |
| 0.9909722222222223 | 0 |
| 0.9916666666666667 | 0 |
| 0.9923611111111111 | 0 |
| 0.9930555555555555 | 0 |
| 0.99375 | 0 |
| 0.9944444444444445 | 0 |
| 0.9951388888888889 | 0 |
| 0.9958333333333332 | 0 |
| 0.9965277777777778 | 0 |
| 0.9972222222222222 | 0 |
| 0.9979166666666667 | 0 |
| 0.998611111111111 | 0 |
| 0.9993055555555556 | 0 |